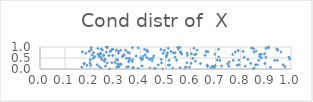
| Category | Series 0 |
|---|---|
| -100.0 | -100000 |
| -100.0 | -100000 |
| -100.0 | -100000 |
| -100.0 | -100000 |
| -100.0 | -100000 |
| -100.0 | -100000 |
| -100.0 | -100000 |
| -100.0 | -100000 |
| -100.0 | -100000 |
| -100.0 | -100000 |
| -100.0 | -100000 |
| -100.0 | -100000 |
| -100.0 | -100000 |
| -100.0 | -100000 |
| -100.0 | -100000 |
| -100.0 | -100000 |
| 0.6911251674152891 | 0.113 |
| -100.0 | -100000 |
| -100.0 | -100000 |
| -100.0 | -100000 |
| 0.48886689146265905 | 0.011 |
| -100.0 | -100000 |
| -100.0 | -100000 |
| -100.0 | -100000 |
| -100.0 | -100000 |
| -100.0 | -100000 |
| 0.49444003822076465 | 0.843 |
| -100.0 | -100000 |
| -100.0 | -100000 |
| -100.0 | -100000 |
| 0.8940189434003815 | 0.696 |
| -100.0 | -100000 |
| -100.0 | -100000 |
| -100.0 | -100000 |
| 0.4009174264647296 | 0.506 |
| -100.0 | -100000 |
| -100.0 | -100000 |
| -100.0 | -100000 |
| -100.0 | -100000 |
| 0.2795988624415633 | 0.803 |
| -100.0 | -100000 |
| -100.0 | -100000 |
| -100.0 | -100000 |
| -100.0 | -100000 |
| -100.0 | -100000 |
| -100.0 | -100000 |
| -100.0 | -100000 |
| 0.2005666875352179 | 0.423 |
| -100.0 | -100000 |
| -100.0 | -100000 |
| -100.0 | -100000 |
| 0.39082303962780784 | 0.96 |
| -100.0 | -100000 |
| -100.0 | -100000 |
| 0.2537636626987898 | 0.637 |
| -100.0 | -100000 |
| 0.4267029095647572 | 0.862 |
| -100.0 | -100000 |
| -100.0 | -100000 |
| -100.0 | -100000 |
| -100.0 | -100000 |
| -100.0 | -100000 |
| -100.0 | -100000 |
| -100.0 | -100000 |
| -100.0 | -100000 |
| -100.0 | -100000 |
| -100.0 | -100000 |
| -100.0 | -100000 |
| -100.0 | -100000 |
| -100.0 | -100000 |
| -100.0 | -100000 |
| -100.0 | -100000 |
| -100.0 | -100000 |
| -100.0 | -100000 |
| -100.0 | -100000 |
| -100.0 | -100000 |
| -100.0 | -100000 |
| -100.0 | -100000 |
| -100.0 | -100000 |
| -100.0 | -100000 |
| -100.0 | -100000 |
| -100.0 | -100000 |
| -100.0 | -100000 |
| -100.0 | -100000 |
| 0.30966216052154816 | 0.417 |
| 0.6676969041368382 | 0.115 |
| -100.0 | -100000 |
| -100.0 | -100000 |
| -100.0 | -100000 |
| -100.0 | -100000 |
| -100.0 | -100000 |
| -100.0 | -100000 |
| 0.5384297635351797 | 0.533 |
| -100.0 | -100000 |
| -100.0 | -100000 |
| -100.0 | -100000 |
| -100.0 | -100000 |
| -100.0 | -100000 |
| -100.0 | -100000 |
| -100.0 | -100000 |
| -100.0 | -100000 |
| -100.0 | -100000 |
| -100.0 | -100000 |
| -100.0 | -100000 |
| -100.0 | -100000 |
| -100.0 | -100000 |
| -100.0 | -100000 |
| -100.0 | -100000 |
| 0.5078637506673386 | 0.727 |
| 0.31218041685391407 | 0.716 |
| -100.0 | -100000 |
| -100.0 | -100000 |
| -100.0 | -100000 |
| -100.0 | -100000 |
| -100.0 | -100000 |
| -100.0 | -100000 |
| -100.0 | -100000 |
| -100.0 | -100000 |
| -100.0 | -100000 |
| 0.8811885823093012 | 0.672 |
| -100.0 | -100000 |
| -100.0 | -100000 |
| -100.0 | -100000 |
| 0.5384002162865781 | 0.726 |
| -100.0 | -100000 |
| 0.2460713559617128 | 0.427 |
| -100.0 | -100000 |
| -100.0 | -100000 |
| -100.0 | -100000 |
| -100.0 | -100000 |
| -100.0 | -100000 |
| -100.0 | -100000 |
| -100.0 | -100000 |
| -100.0 | -100000 |
| -100.0 | -100000 |
| -100.0 | -100000 |
| 0.4091349326783015 | 0.449 |
| -100.0 | -100000 |
| -100.0 | -100000 |
| -100.0 | -100000 |
| 0.24106122584608847 | 0.714 |
| -100.0 | -100000 |
| -100.0 | -100000 |
| -100.0 | -100000 |
| -100.0 | -100000 |
| -100.0 | -100000 |
| -100.0 | -100000 |
| -100.0 | -100000 |
| 0.6696825330825373 | 0.782 |
| -100.0 | -100000 |
| -100.0 | -100000 |
| -100.0 | -100000 |
| -100.0 | -100000 |
| -100.0 | -100000 |
| -100.0 | -100000 |
| -100.0 | -100000 |
| -100.0 | -100000 |
| -100.0 | -100000 |
| 0.437792104982175 | 0.047 |
| -100.0 | -100000 |
| 0.23637617588162474 | 0.108 |
| -100.0 | -100000 |
| -100.0 | -100000 |
| -100.0 | -100000 |
| -100.0 | -100000 |
| 0.7537033022877326 | 0.322 |
| -100.0 | -100000 |
| -100.0 | -100000 |
| -100.0 | -100000 |
| -100.0 | -100000 |
| -100.0 | -100000 |
| -100.0 | -100000 |
| -100.0 | -100000 |
| -100.0 | -100000 |
| -100.0 | -100000 |
| -100.0 | -100000 |
| -100.0 | -100000 |
| -100.0 | -100000 |
| -100.0 | -100000 |
| -100.0 | -100000 |
| -100.0 | -100000 |
| -100.0 | -100000 |
| -100.0 | -100000 |
| -100.0 | -100000 |
| -100.0 | -100000 |
| -100.0 | -100000 |
| 0.828207965474122 | 0.436 |
| -100.0 | -100000 |
| -100.0 | -100000 |
| -100.0 | -100000 |
| -100.0 | -100000 |
| -100.0 | -100000 |
| -100.0 | -100000 |
| -100.0 | -100000 |
| 0.48152047882037907 | 0.889 |
| -100.0 | -100000 |
| -100.0 | -100000 |
| -100.0 | -100000 |
| -100.0 | -100000 |
| 0.5484991682767899 | 0.988 |
| -100.0 | -100000 |
| -100.0 | -100000 |
| -100.0 | -100000 |
| -100.0 | -100000 |
| -100.0 | -100000 |
| -100.0 | -100000 |
| 0.453228374563574 | 0.594 |
| -100.0 | -100000 |
| -100.0 | -100000 |
| -100.0 | -100000 |
| -100.0 | -100000 |
| 0.31120991710814794 | 0.163 |
| -100.0 | -100000 |
| -100.0 | -100000 |
| 0.5853948787989078 | 0.285 |
| -100.0 | -100000 |
| -100.0 | -100000 |
| -100.0 | -100000 |
| 0.9920021001917905 | 0.541 |
| 0.1829123607369415 | 0.72 |
| -100.0 | -100000 |
| -100.0 | -100000 |
| -100.0 | -100000 |
| -100.0 | -100000 |
| -100.0 | -100000 |
| -100.0 | -100000 |
| 0.6036262819236347 | 0.694 |
| -100.0 | -100000 |
| -100.0 | -100000 |
| -100.0 | -100000 |
| -100.0 | -100000 |
| -100.0 | -100000 |
| -100.0 | -100000 |
| -100.0 | -100000 |
| -100.0 | -100000 |
| -100.0 | -100000 |
| 0.4163861111146401 | 0.892 |
| 0.4548130617133127 | 0.025 |
| -100.0 | -100000 |
| -100.0 | -100000 |
| -100.0 | -100000 |
| 0.8998755817381265 | 0.534 |
| -100.0 | -100000 |
| -100.0 | -100000 |
| -100.0 | -100000 |
| 0.6966252873544871 | 0.674 |
| 0.8610922900696134 | 0.818 |
| -100.0 | -100000 |
| -100.0 | -100000 |
| -100.0 | -100000 |
| -100.0 | -100000 |
| -100.0 | -100000 |
| -100.0 | -100000 |
| -100.0 | -100000 |
| -100.0 | -100000 |
| 0.9346668107567094 | 0.388 |
| 0.6135546338193986 | 0.945 |
| -100.0 | -100000 |
| -100.0 | -100000 |
| -100.0 | -100000 |
| -100.0 | -100000 |
| -100.0 | -100000 |
| -100.0 | -100000 |
| -100.0 | -100000 |
| -100.0 | -100000 |
| -100.0 | -100000 |
| 0.3679770713765058 | 0.964 |
| -100.0 | -100000 |
| 0.685675390384214 | 0.12 |
| 0.23658098842973296 | 0.691 |
| -100.0 | -100000 |
| -100.0 | -100000 |
| -100.0 | -100000 |
| -100.0 | -100000 |
| -100.0 | -100000 |
| -100.0 | -100000 |
| -100.0 | -100000 |
| -100.0 | -100000 |
| -100.0 | -100000 |
| -100.0 | -100000 |
| -100.0 | -100000 |
| -100.0 | -100000 |
| -100.0 | -100000 |
| 0.5643184753102864 | 0.683 |
| -100.0 | -100000 |
| -100.0 | -100000 |
| 0.2363296149291294 | 0.582 |
| -100.0 | -100000 |
| -100.0 | -100000 |
| -100.0 | -100000 |
| -100.0 | -100000 |
| -100.0 | -100000 |
| -100.0 | -100000 |
| -100.0 | -100000 |
| -100.0 | -100000 |
| -100.0 | -100000 |
| -100.0 | -100000 |
| -100.0 | -100000 |
| -100.0 | -100000 |
| -100.0 | -100000 |
| -100.0 | -100000 |
| -100.0 | -100000 |
| -100.0 | -100000 |
| -100.0 | -100000 |
| -100.0 | -100000 |
| -100.0 | -100000 |
| -100.0 | -100000 |
| 0.5616486191059832 | 0.738 |
| -100.0 | -100000 |
| -100.0 | -100000 |
| -100.0 | -100000 |
| -100.0 | -100000 |
| -100.0 | -100000 |
| 0.7237477230589877 | 0.139 |
| -100.0 | -100000 |
| 0.2862308142494009 | 0.291 |
| -100.0 | -100000 |
| -100.0 | -100000 |
| -100.0 | -100000 |
| -100.0 | -100000 |
| 0.2134899707689114 | 0.744 |
| -100.0 | -100000 |
| 0.30708993372529425 | 0.078 |
| -100.0 | -100000 |
| -100.0 | -100000 |
| -100.0 | -100000 |
| -100.0 | -100000 |
| -100.0 | -100000 |
| -100.0 | -100000 |
| -100.0 | -100000 |
| -100.0 | -100000 |
| -100.0 | -100000 |
| -100.0 | -100000 |
| -100.0 | -100000 |
| -100.0 | -100000 |
| -100.0 | -100000 |
| -100.0 | -100000 |
| 0.3709994795336864 | 0.07 |
| 0.3408912464100242 | 0.854 |
| 0.7166363945163503 | 0.389 |
| 0.8819338260425571 | 0.496 |
| -100.0 | -100000 |
| -100.0 | -100000 |
| -100.0 | -100000 |
| -100.0 | -100000 |
| -100.0 | -100000 |
| -100.0 | -100000 |
| -100.0 | -100000 |
| -100.0 | -100000 |
| -100.0 | -100000 |
| -100.0 | -100000 |
| -100.0 | -100000 |
| 0.2769675515604617 | 0.008 |
| -100.0 | -100000 |
| -100.0 | -100000 |
| -100.0 | -100000 |
| -100.0 | -100000 |
| -100.0 | -100000 |
| -100.0 | -100000 |
| 0.26392756684295726 | 0.762 |
| -100.0 | -100000 |
| -100.0 | -100000 |
| -100.0 | -100000 |
| 0.5214291495465175 | 0.802 |
| -100.0 | -100000 |
| -100.0 | -100000 |
| -100.0 | -100000 |
| -100.0 | -100000 |
| -100.0 | -100000 |
| 0.5103756670690924 | 0.174 |
| 0.2600056432713117 | 0.436 |
| -100.0 | -100000 |
| -100.0 | -100000 |
| -100.0 | -100000 |
| 0.2644538416108243 | 0.992 |
| -100.0 | -100000 |
| -100.0 | -100000 |
| -100.0 | -100000 |
| -100.0 | -100000 |
| 0.25786820016591294 | 0.433 |
| -100.0 | -100000 |
| -100.0 | -100000 |
| -100.0 | -100000 |
| -100.0 | -100000 |
| -100.0 | -100000 |
| -100.0 | -100000 |
| -100.0 | -100000 |
| 0.6191929837072504 | 0.356 |
| -100.0 | -100000 |
| -100.0 | -100000 |
| -100.0 | -100000 |
| -100.0 | -100000 |
| 0.2897228907882524 | 0.894 |
| -100.0 | -100000 |
| -100.0 | -100000 |
| -100.0 | -100000 |
| -100.0 | -100000 |
| -100.0 | -100000 |
| 0.7898822741128966 | 0.841 |
| 0.3107186546408738 | 0.232 |
| -100.0 | -100000 |
| -100.0 | -100000 |
| -100.0 | -100000 |
| -100.0 | -100000 |
| 0.31509242902365453 | 0.099 |
| -100.0 | -100000 |
| -100.0 | -100000 |
| -100.0 | -100000 |
| -100.0 | -100000 |
| -100.0 | -100000 |
| -100.0 | -100000 |
| -100.0 | -100000 |
| -100.0 | -100000 |
| -100.0 | -100000 |
| -100.0 | -100000 |
| -100.0 | -100000 |
| -100.0 | -100000 |
| -100.0 | -100000 |
| -100.0 | -100000 |
| -100.0 | -100000 |
| 0.5109692160586634 | 0.941 |
| -100.0 | -100000 |
| -100.0 | -100000 |
| 0.23112572126752928 | 0.661 |
| 0.712271480761337 | 0.545 |
| -100.0 | -100000 |
| -100.0 | -100000 |
| 0.17630151895946478 | 0.249 |
| -100.0 | -100000 |
| -100.0 | -100000 |
| -100.0 | -100000 |
| -100.0 | -100000 |
| 0.909513440735538 | 0.998 |
| -100.0 | -100000 |
| -100.0 | -100000 |
| -100.0 | -100000 |
| -100.0 | -100000 |
| -100.0 | -100000 |
| -100.0 | -100000 |
| -100.0 | -100000 |
| -100.0 | -100000 |
| -100.0 | -100000 |
| -100.0 | -100000 |
| 0.5572627276432692 | 0.982 |
| -100.0 | -100000 |
| -100.0 | -100000 |
| -100.0 | -100000 |
| -100.0 | -100000 |
| -100.0 | -100000 |
| 0.6943548328728621 | 0.044 |
| -100.0 | -100000 |
| 0.9759220154674753 | 0.108 |
| -100.0 | -100000 |
| -100.0 | -100000 |
| -100.0 | -100000 |
| 0.850955545573084 | 0.924 |
| -100.0 | -100000 |
| -100.0 | -100000 |
| -100.0 | -100000 |
| -100.0 | -100000 |
| -100.0 | -100000 |
| -100.0 | -100000 |
| -100.0 | -100000 |
| -100.0 | -100000 |
| -100.0 | -100000 |
| 0.9687554515593477 | 0.191 |
| 0.8095740804580962 | 0.801 |
| -100.0 | -100000 |
| -100.0 | -100000 |
| -100.0 | -100000 |
| -100.0 | -100000 |
| -100.0 | -100000 |
| -100.0 | -100000 |
| 0.6981972049517814 | 0.155 |
| 0.6212745514248764 | 0.682 |
| -100.0 | -100000 |
| -100.0 | -100000 |
| -100.0 | -100000 |
| -100.0 | -100000 |
| -100.0 | -100000 |
| -100.0 | -100000 |
| 0.7113326645951574 | 0.893 |
| -100.0 | -100000 |
| -100.0 | -100000 |
| -100.0 | -100000 |
| -100.0 | -100000 |
| 0.2875408155738086 | 0.893 |
| -100.0 | -100000 |
| -100.0 | -100000 |
| -100.0 | -100000 |
| -100.0 | -100000 |
| -100.0 | -100000 |
| -100.0 | -100000 |
| -100.0 | -100000 |
| -100.0 | -100000 |
| 0.6390651746966921 | 0.247 |
| 0.34986189843045024 | 0.761 |
| -100.0 | -100000 |
| 0.16895236248645729 | 0.783 |
| -100.0 | -100000 |
| -100.0 | -100000 |
| -100.0 | -100000 |
| -100.0 | -100000 |
| -100.0 | -100000 |
| -100.0 | -100000 |
| -100.0 | -100000 |
| -100.0 | -100000 |
| -100.0 | -100000 |
| -100.0 | -100000 |
| -100.0 | -100000 |
| -100.0 | -100000 |
| -100.0 | -100000 |
| -100.0 | -100000 |
| -100.0 | -100000 |
| -100.0 | -100000 |
| -100.0 | -100000 |
| -100.0 | -100000 |
| 0.5285534354320617 | 0.038 |
| -100.0 | -100000 |
| -100.0 | -100000 |
| -100.0 | -100000 |
| -100.0 | -100000 |
| 0.29986575364910206 | 0.298 |
| 0.9455737335697572 | 0.396 |
| -100.0 | -100000 |
| -100.0 | -100000 |
| -100.0 | -100000 |
| -100.0 | -100000 |
| -100.0 | -100000 |
| -100.0 | -100000 |
| -100.0 | -100000 |
| -100.0 | -100000 |
| -100.0 | -100000 |
| -100.0 | -100000 |
| -100.0 | -100000 |
| -100.0 | -100000 |
| -100.0 | -100000 |
| -100.0 | -100000 |
| -100.0 | -100000 |
| -100.0 | -100000 |
| -100.0 | -100000 |
| -100.0 | -100000 |
| -100.0 | -100000 |
| 0.8492679933014774 | 0.004 |
| 0.20424389302088386 | 0.885 |
| -100.0 | -100000 |
| -100.0 | -100000 |
| -100.0 | -100000 |
| -100.0 | -100000 |
| -100.0 | -100000 |
| -100.0 | -100000 |
| -100.0 | -100000 |
| -100.0 | -100000 |
| -100.0 | -100000 |
| -100.0 | -100000 |
| 0.5443464411421778 | 0.399 |
| 0.5159663884181479 | 0.183 |
| -100.0 | -100000 |
| -100.0 | -100000 |
| -100.0 | -100000 |
| -100.0 | -100000 |
| 0.8743146102263845 | 0.657 |
| -100.0 | -100000 |
| 0.30467474452308263 | 0.857 |
| -100.0 | -100000 |
| -100.0 | -100000 |
| 0.5783567443921008 | 0.049 |
| -100.0 | -100000 |
| -100.0 | -100000 |
| 0.6808432521360834 | 0.043 |
| -100.0 | -100000 |
| -100.0 | -100000 |
| -100.0 | -100000 |
| -100.0 | -100000 |
| -100.0 | -100000 |
| -100.0 | -100000 |
| -100.0 | -100000 |
| -100.0 | -100000 |
| -100.0 | -100000 |
| 0.2120620871160438 | 0.49 |
| -100.0 | -100000 |
| -100.0 | -100000 |
| 0.8177282866938845 | 0.127 |
| -100.0 | -100000 |
| -100.0 | -100000 |
| -100.0 | -100000 |
| -100.0 | -100000 |
| 0.33534413295646426 | 0.652 |
| 0.23068043249648296 | 0.933 |
| -100.0 | -100000 |
| -100.0 | -100000 |
| -100.0 | -100000 |
| 0.3720139003611309 | 0.044 |
| -100.0 | -100000 |
| 0.2538154610130712 | 0.61 |
| -100.0 | -100000 |
| -100.0 | -100000 |
| -100.0 | -100000 |
| -100.0 | -100000 |
| -100.0 | -100000 |
| -100.0 | -100000 |
| 0.9601877910910298 | 0.775 |
| -100.0 | -100000 |
| -100.0 | -100000 |
| 0.858581546371001 | 0.191 |
| -100.0 | -100000 |
| -100.0 | -100000 |
| -100.0 | -100000 |
| -100.0 | -100000 |
| -100.0 | -100000 |
| -100.0 | -100000 |
| 0.5058982550552046 | 0.63 |
| -100.0 | -100000 |
| -100.0 | -100000 |
| -100.0 | -100000 |
| -100.0 | -100000 |
| -100.0 | -100000 |
| -100.0 | -100000 |
| -100.0 | -100000 |
| 0.7057183798939198 | 0.406 |
| -100.0 | -100000 |
| -100.0 | -100000 |
| -100.0 | -100000 |
| -100.0 | -100000 |
| -100.0 | -100000 |
| -100.0 | -100000 |
| -100.0 | -100000 |
| -100.0 | -100000 |
| -100.0 | -100000 |
| -100.0 | -100000 |
| -100.0 | -100000 |
| -100.0 | -100000 |
| -100.0 | -100000 |
| -100.0 | -100000 |
| -100.0 | -100000 |
| -100.0 | -100000 |
| -100.0 | -100000 |
| -100.0 | -100000 |
| -100.0 | -100000 |
| -100.0 | -100000 |
| -100.0 | -100000 |
| 0.32798840503197346 | 0.575 |
| -100.0 | -100000 |
| -100.0 | -100000 |
| -100.0 | -100000 |
| -100.0 | -100000 |
| -100.0 | -100000 |
| 0.28180749219262236 | 0.822 |
| 0.7927044080365443 | 0.194 |
| -100.0 | -100000 |
| -100.0 | -100000 |
| -100.0 | -100000 |
| -100.0 | -100000 |
| -100.0 | -100000 |
| -100.0 | -100000 |
| -100.0 | -100000 |
| -100.0 | -100000 |
| -100.0 | -100000 |
| 0.25642496627907174 | 0.354 |
| -100.0 | -100000 |
| -100.0 | -100000 |
| -100.0 | -100000 |
| -100.0 | -100000 |
| -100.0 | -100000 |
| -100.0 | -100000 |
| -100.0 | -100000 |
| 0.20235274228006872 | 0.162 |
| -100.0 | -100000 |
| -100.0 | -100000 |
| -100.0 | -100000 |
| -100.0 | -100000 |
| -100.0 | -100000 |
| -100.0 | -100000 |
| -100.0 | -100000 |
| -100.0 | -100000 |
| -100.0 | -100000 |
| -100.0 | -100000 |
| -100.0 | -100000 |
| -100.0 | -100000 |
| -100.0 | -100000 |
| -100.0 | -100000 |
| -100.0 | -100000 |
| -100.0 | -100000 |
| -100.0 | -100000 |
| -100.0 | -100000 |
| -100.0 | -100000 |
| -100.0 | -100000 |
| -100.0 | -100000 |
| -100.0 | -100000 |
| -100.0 | -100000 |
| -100.0 | -100000 |
| 0.6158712301253491 | 0.648 |
| -100.0 | -100000 |
| -100.0 | -100000 |
| -100.0 | -100000 |
| -100.0 | -100000 |
| -100.0 | -100000 |
| 0.9436007668757045 | 0.909 |
| -100.0 | -100000 |
| -100.0 | -100000 |
| -100.0 | -100000 |
| -100.0 | -100000 |
| -100.0 | -100000 |
| -100.0 | -100000 |
| -100.0 | -100000 |
| -100.0 | -100000 |
| -100.0 | -100000 |
| -100.0 | -100000 |
| -100.0 | -100000 |
| -100.0 | -100000 |
| -100.0 | -100000 |
| 0.8957127244459342 | 0.251 |
| -100.0 | -100000 |
| -100.0 | -100000 |
| -100.0 | -100000 |
| -100.0 | -100000 |
| -100.0 | -100000 |
| -100.0 | -100000 |
| 0.21844371626694759 | 0.564 |
| -100.0 | -100000 |
| -100.0 | -100000 |
| 0.6085500740780259 | 0.478 |
| -100.0 | -100000 |
| -100.0 | -100000 |
| 0.8396298448938005 | 0.254 |
| 0.42877620942189654 | 0.799 |
| -100.0 | -100000 |
| 0.42523756484788533 | 0.52 |
| -100.0 | -100000 |
| -100.0 | -100000 |
| -100.0 | -100000 |
| -100.0 | -100000 |
| 0.3228500465326941 | 0.211 |
| -100.0 | -100000 |
| -100.0 | -100000 |
| -100.0 | -100000 |
| -100.0 | -100000 |
| 0.483193120007256 | 0.435 |
| -100.0 | -100000 |
| 0.513940587841023 | 0.395 |
| 0.49018342188590847 | 0.717 |
| -100.0 | -100000 |
| -100.0 | -100000 |
| -100.0 | -100000 |
| -100.0 | -100000 |
| -100.0 | -100000 |
| -100.0 | -100000 |
| -100.0 | -100000 |
| -100.0 | -100000 |
| -100.0 | -100000 |
| -100.0 | -100000 |
| -100.0 | -100000 |
| 0.5871656346374934 | 0.615 |
| -100.0 | -100000 |
| -100.0 | -100000 |
| -100.0 | -100000 |
| -100.0 | -100000 |
| -100.0 | -100000 |
| -100.0 | -100000 |
| -100.0 | -100000 |
| -100.0 | -100000 |
| -100.0 | -100000 |
| -100.0 | -100000 |
| -100.0 | -100000 |
| -100.0 | -100000 |
| -100.0 | -100000 |
| 0.2690816644853091 | 0.973 |
| 0.8429464616967483 | 0.95 |
| -100.0 | -100000 |
| -100.0 | -100000 |
| 0.3217978991043915 | 0.852 |
| -100.0 | -100000 |
| -100.0 | -100000 |
| -100.0 | -100000 |
| -100.0 | -100000 |
| 0.3449800219546849 | 0.485 |
| -100.0 | -100000 |
| 0.7677947533309976 | 0.663 |
| 0.5863949949909036 | 0.721 |
| 0.4610385372123528 | 0.016 |
| 0.17660073145102229 | 0.237 |
| -100.0 | -100000 |
| -100.0 | -100000 |
| -100.0 | -100000 |
| 0.6575587527489755 | 0.621 |
| -100.0 | -100000 |
| 0.8709521881810528 | 0.392 |
| -100.0 | -100000 |
| -100.0 | -100000 |
| 0.3565481504313094 | 0.721 |
| 0.7477715217816964 | 0.234 |
| -100.0 | -100000 |
| -100.0 | -100000 |
| -100.0 | -100000 |
| -100.0 | -100000 |
| -100.0 | -100000 |
| -100.0 | -100000 |
| -100.0 | -100000 |
| -100.0 | -100000 |
| 0.8519263335186439 | 0.773 |
| -100.0 | -100000 |
| -100.0 | -100000 |
| 0.36890786771277406 | 0.036 |
| -100.0 | -100000 |
| -100.0 | -100000 |
| -100.0 | -100000 |
| -100.0 | -100000 |
| -100.0 | -100000 |
| -100.0 | -100000 |
| 0.9187495597858212 | 0.072 |
| -100.0 | -100000 |
| -100.0 | -100000 |
| -100.0 | -100000 |
| -100.0 | -100000 |
| 0.7695083161962607 | 0.395 |
| 0.23469365761950778 | 0.637 |
| -100.0 | -100000 |
| -100.0 | -100000 |
| -100.0 | -100000 |
| -100.0 | -100000 |
| -100.0 | -100000 |
| -100.0 | -100000 |
| -100.0 | -100000 |
| -100.0 | -100000 |
| -100.0 | -100000 |
| 0.5815376944491828 | 0.095 |
| -100.0 | -100000 |
| 0.31391818918975534 | 0.803 |
| -100.0 | -100000 |
| -100.0 | -100000 |
| 0.4484074672737868 | 0.487 |
| -100.0 | -100000 |
| -100.0 | -100000 |
| -100.0 | -100000 |
| -100.0 | -100000 |
| -100.0 | -100000 |
| 0.8756026072972668 | 0.568 |
| -100.0 | -100000 |
| -100.0 | -100000 |
| -100.0 | -100000 |
| -100.0 | -100000 |
| -100.0 | -100000 |
| 0.2446604800724499 | 0.518 |
| 0.3045083309073161 | 0.431 |
| -100.0 | -100000 |
| -100.0 | -100000 |
| -100.0 | -100000 |
| -100.0 | -100000 |
| -100.0 | -100000 |
| -100.0 | -100000 |
| -100.0 | -100000 |
| -100.0 | -100000 |
| -100.0 | -100000 |
| 0.24435643451029998 | 0.907 |
| -100.0 | -100000 |
| -100.0 | -100000 |
| -100.0 | -100000 |
| -100.0 | -100000 |
| 0.7921139975106384 | 0.402 |
| -100.0 | -100000 |
| -100.0 | -100000 |
| -100.0 | -100000 |
| -100.0 | -100000 |
| -100.0 | -100000 |
| -100.0 | -100000 |
| -100.0 | -100000 |
| -100.0 | -100000 |
| -100.0 | -100000 |
| -100.0 | -100000 |
| -100.0 | -100000 |
| -100.0 | -100000 |
| -100.0 | -100000 |
| -100.0 | -100000 |
| -100.0 | -100000 |
| 0.4842520160996946 | 0.276 |
| 0.19939431844148825 | 0.274 |
| 0.26086815685025355 | 0.131 |
| -100.0 | -100000 |
| -100.0 | -100000 |
| -100.0 | -100000 |
| -100.0 | -100000 |
| -100.0 | -100000 |
| -100.0 | -100000 |
| -100.0 | -100000 |
| 0.24861965754559945 | 0.86 |
| -100.0 | -100000 |
| -100.0 | -100000 |
| -100.0 | -100000 |
| -100.0 | -100000 |
| -100.0 | -100000 |
| -100.0 | -100000 |
| -100.0 | -100000 |
| -100.0 | -100000 |
| -100.0 | -100000 |
| -100.0 | -100000 |
| 0.5030586583275444 | 0.552 |
| -100.0 | -100000 |
| -100.0 | -100000 |
| -100.0 | -100000 |
| 0.6017000606079604 | 0.262 |
| -100.0 | -100000 |
| -100.0 | -100000 |
| -100.0 | -100000 |
| -100.0 | -100000 |
| -100.0 | -100000 |
| -100.0 | -100000 |
| 0.1955248446630159 | 0.8 |
| -100.0 | -100000 |
| -100.0 | -100000 |
| -100.0 | -100000 |
| -100.0 | -100000 |
| -100.0 | -100000 |
| 0.7532712870306261 | 0.125 |
| -100.0 | -100000 |
| -100.0 | -100000 |
| -100.0 | -100000 |
| -100.0 | -100000 |
| -100.0 | -100000 |
| -100.0 | -100000 |
| -100.0 | -100000 |
| -100.0 | -100000 |
| -100.0 | -100000 |
| -100.0 | -100000 |
| 0.2086732473040449 | 0.635 |
| -100.0 | -100000 |
| -100.0 | -100000 |
| 0.9948650111085214 | 0.452 |
| -100.0 | -100000 |
| -100.0 | -100000 |
| 0.36885202388117233 | 0.426 |
| -100.0 | -100000 |
| -100.0 | -100000 |
| -100.0 | -100000 |
| -100.0 | -100000 |
| -100.0 | -100000 |
| 0.5508247108546572 | 0.912 |
| -100.0 | -100000 |
| -100.0 | -100000 |
| -100.0 | -100000 |
| 0.7857364894219597 | 0.166 |
| 0.2438688421571209 | 0.032 |
| -100.0 | -100000 |
| -100.0 | -100000 |
| -100.0 | -100000 |
| -100.0 | -100000 |
| -100.0 | -100000 |
| -100.0 | -100000 |
| -100.0 | -100000 |
| -100.0 | -100000 |
| 0.9006894851525961 | 0.946 |
| 0.9106857419994582 | 0.969 |
| -100.0 | -100000 |
| -100.0 | -100000 |
| -100.0 | -100000 |
| -100.0 | -100000 |
| -100.0 | -100000 |
| -100.0 | -100000 |
| -100.0 | -100000 |
| -100.0 | -100000 |
| -100.0 | -100000 |
| -100.0 | -100000 |
| 0.3454722894058999 | 0.086 |
| -100.0 | -100000 |
| -100.0 | -100000 |
| -100.0 | -100000 |
| -100.0 | -100000 |
| -100.0 | -100000 |
| -100.0 | -100000 |
| -100.0 | -100000 |
| -100.0 | -100000 |
| -100.0 | -100000 |
| 0.367298176375385 | 0.343 |
| -100.0 | -100000 |
| 0.6665426660436288 | 0.178 |
| -100.0 | -100000 |
| 0.3559624106559276 | 0.497 |
| -100.0 | -100000 |
| -100.0 | -100000 |
| 0.22751199716939396 | 0.193 |
| -100.0 | -100000 |
| -100.0 | -100000 |
| -100.0 | -100000 |
| -100.0 | -100000 |
| -100.0 | -100000 |
| -100.0 | -100000 |
| -100.0 | -100000 |
| -100.0 | -100000 |
| -100.0 | -100000 |
| -100.0 | -100000 |
| -100.0 | -100000 |
| -100.0 | -100000 |
| -100.0 | -100000 |
| -100.0 | -100000 |
| -100.0 | -100000 |
| -100.0 | -100000 |
| -100.0 | -100000 |
| -100.0 | -100000 |
| -100.0 | -100000 |
| -100.0 | -100000 |
| -100.0 | -100000 |
| -100.0 | -100000 |
| -100.0 | -100000 |
| -100.0 | -100000 |
| -100.0 | -100000 |
| -100.0 | -100000 |
| -100.0 | -100000 |
| -100.0 | -100000 |
| -100.0 | -100000 |
| -100.0 | -100000 |
| -100.0 | -100000 |
| -100.0 | -100000 |
| -100.0 | -100000 |
| -100.0 | -100000 |
| -100.0 | -100000 |
| 0.40695343563124786 | 0.141 |
| -100.0 | -100000 |
| -100.0 | -100000 |
| -100.0 | -100000 |
| -100.0 | -100000 |
| -100.0 | -100000 |
| -100.0 | -100000 |
| -100.0 | -100000 |
| -100.0 | -100000 |
| -100.0 | -100000 |
| -100.0 | -100000 |
| -100.0 | -100000 |
| -100.0 | -100000 |
| -100.0 | -100000 |
| -100.0 | -100000 |
| 0.8135408068857775 | 0.527 |
| -100.0 | -100000 |
| -100.0 | -100000 |
| -100.0 | -100000 |
| -100.0 | -100000 |
| -100.0 | -100000 |
| -100.0 | -100000 |
| 0.383034829840718 | 0.594 |
| -100.0 | -100000 |
| -100.0 | -100000 |
| 0.4711379580730375 | 0.187 |
| -100.0 | -100000 |
| -100.0 | -100000 |
| -100.0 | -100000 |
| -100.0 | -100000 |
| -100.0 | -100000 |
| -100.0 | -100000 |
| -100.0 | -100000 |
| 0.8661536519169153 | 0.199 |
| -100.0 | -100000 |
| -100.0 | -100000 |
| 0.29000786358686725 | 0.613 |
| -100.0 | -100000 |
| -100.0 | -100000 |
| -100.0 | -100000 |
| -100.0 | -100000 |
| -100.0 | -100000 |
| -100.0 | -100000 |
| -100.0 | -100000 |
| -100.0 | -100000 |
| -100.0 | -100000 |
| -100.0 | -100000 |
| 0.16678795194657048 | 0.09 |
| -100.0 | -100000 |
| -100.0 | -100000 |
| -100.0 | -100000 |
| -100.0 | -100000 |
| -100.0 | -100000 |
| -100.0 | -100000 |
| -100.0 | -100000 |
| 0.5948627329447421 | 0.07 |
| 0.33229218189320997 | 0.597 |
| -100.0 | -100000 |
| -100.0 | -100000 |
| -100.0 | -100000 |
| -100.0 | -100000 |
| -100.0 | -100000 |
| -100.0 | -100000 |
| -100.0 | -100000 |
| -100.0 | -100000 |
| -100.0 | -100000 |
| -100.0 | -100000 |
| -100.0 | -100000 |
| -100.0 | -100000 |
| -100.0 | -100000 |
| -100.0 | -100000 |
| -100.0 | -100000 |
| -100.0 | -100000 |
| -100.0 | -100000 |
| -100.0 | -100000 |
| -100.0 | -100000 |
| -100.0 | -100000 |
| 0.5596048970986797 | 0.789 |
| -100.0 | -100000 |
| 0.5622839479092959 | 0.718 |
| 0.5586219329744835 | 0.061 |
| -100.0 | -100000 |
| -100.0 | -100000 |
| -100.0 | -100000 |
| -100.0 | -100000 |
| -100.0 | -100000 |
| -100.0 | -100000 |
| -100.0 | -100000 |
| -100.0 | -100000 |
| -100.0 | -100000 |
| -100.0 | -100000 |
| -100.0 | -100000 |
| -100.0 | -100000 |
| 0.946696297168931 | 0.854 |
| 0.8535859585788332 | 0.036 |
| -100.0 | -100000 |
| -100.0 | -100000 |
| -100.0 | -100000 |
| -100.0 | -100000 |
| -100.0 | -100000 |
| -100.0 | -100000 |
| -100.0 | -100000 |
| -100.0 | -100000 |
| -100.0 | -100000 |
| -100.0 | -100000 |
| -100.0 | -100000 |
| 0.26784474762153565 | 0.272 |
| 0.5306999821848432 | 0.742 |
| -100.0 | -100000 |
| -100.0 | -100000 |
| -100.0 | -100000 |
| -100.0 | -100000 |
| 0.35325317669897205 | 0.329 |
| 0.40546068263452584 | 0.423 |
| 0.7781323960090627 | 0.775 |
| -100.0 | -100000 |
| -100.0 | -100000 |
| 0.44661754147038724 | 0.366 |
| -100.0 | -100000 |
| 0.6624132644335224 | 0.805 |
| -100.0 | -100000 |
| -100.0 | -100000 |
| -100.0 | -100000 |
| -100.0 | -100000 |
| -100.0 | -100000 |
| -100.0 | -100000 |
| -100.0 | -100000 |
| -100.0 | -100000 |
| -100.0 | -100000 |
| 0.35170557079484965 | 0.103 |
| -100.0 | -100000 |
| 0.1870904330517873 | 0.163 |
| -100.0 | -100000 |
| -100.0 | -100000 |
| -100.0 | -100000 |
| -100.0 | -100000 |
| 0.3564952218309021 | 0.411 |
| -100.0 | -100000 |
| -100.0 | -100000 |
| -100.0 | -100000 |
| -100.0 | -100000 |
| -100.0 | -100000 |
| -100.0 | -100000 |
| 0.3205936589605495 | 0.224 |
| -100.0 | -100000 |
| -100.0 | -100000 |
| -100.0 | -100000 |
| -100.0 | -100000 |
| 0.42603561716228266 | 0.814 |
| -100.0 | -100000 |
| 0.24100698304136925 | 0.69 |
| -100.0 | -100000 |
| -100.0 | -100000 |
| -100.0 | -100000 |
| -100.0 | -100000 |
| -100.0 | -100000 |
| 0.6258310341714435 | 0.857 |
| -100.0 | -100000 |
| -100.0 | -100000 |
| 0.43994246545369686 | 0.455 |
| -100.0 | -100000 |
| -100.0 | -100000 |
| -100.0 | -100000 |
| 0.4106376624540222 | 0.58 |
| 0.4191172235044166 | 0.64 |
| 0.4347438882867555 | 0.445 |
| -100.0 | -100000 |
| -100.0 | -100000 |
| -100.0 | -100000 |
| -100.0 | -100000 |
| -100.0 | -100000 |
| -100.0 | -100000 |
| -100.0 | -100000 |
| -100.0 | -100000 |
| -100.0 | -100000 |
| -100.0 | -100000 |
| 0.2747896110495942 | 0.619 |
| -100.0 | -100000 |
| -100.0 | -100000 |
| -100.0 | -100000 |
| -100.0 | -100000 |
| -100.0 | -100000 |
| 0.2361663532935263 | 0.576 |
| -100.0 | -100000 |
| -100.0 | -100000 |
| 0.39054517416655465 | 0.03 |
| -100.0 | -100000 |
| -100.0 | -100000 |
| -100.0 | -100000 |
| -100.0 | -100000 |
| -100.0 | -100000 |
| -100.0 | -100000 |
| -100.0 | -100000 |
| 0.6633970550106446 | 0.783 |
| -100.0 | -100000 |
| 0.2039334178060398 | 0.972 |
| -100.0 | -100000 |
| -100.0 | -100000 |
| -100.0 | -100000 |